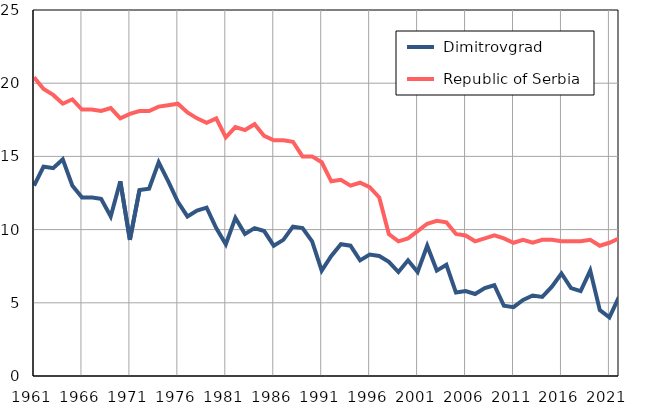
| Category |  Dimitrovgrad |  Republic of Serbia |
|---|---|---|
| 1961.0 | 13 | 20.4 |
| 1962.0 | 14.3 | 19.6 |
| 1963.0 | 14.2 | 19.2 |
| 1964.0 | 14.8 | 18.6 |
| 1965.0 | 13 | 18.9 |
| 1966.0 | 12.2 | 18.2 |
| 1967.0 | 12.2 | 18.2 |
| 1968.0 | 12.1 | 18.1 |
| 1969.0 | 10.9 | 18.3 |
| 1970.0 | 13.3 | 17.6 |
| 1971.0 | 9.3 | 17.9 |
| 1972.0 | 12.7 | 18.1 |
| 1973.0 | 12.8 | 18.1 |
| 1974.0 | 14.6 | 18.4 |
| 1975.0 | 13.3 | 18.5 |
| 1976.0 | 11.9 | 18.6 |
| 1977.0 | 10.9 | 18 |
| 1978.0 | 11.3 | 17.6 |
| 1979.0 | 11.5 | 17.3 |
| 1980.0 | 10.1 | 17.6 |
| 1981.0 | 9 | 16.3 |
| 1982.0 | 10.8 | 17 |
| 1983.0 | 9.7 | 16.8 |
| 1984.0 | 10.1 | 17.2 |
| 1985.0 | 9.9 | 16.4 |
| 1986.0 | 8.9 | 16.1 |
| 1987.0 | 9.3 | 16.1 |
| 1988.0 | 10.2 | 16 |
| 1989.0 | 10.1 | 15 |
| 1990.0 | 9.2 | 15 |
| 1991.0 | 7.2 | 14.6 |
| 1992.0 | 8.2 | 13.3 |
| 1993.0 | 9 | 13.4 |
| 1994.0 | 8.9 | 13 |
| 1995.0 | 7.9 | 13.2 |
| 1996.0 | 8.3 | 12.9 |
| 1997.0 | 8.2 | 12.2 |
| 1998.0 | 7.8 | 9.7 |
| 1999.0 | 7.1 | 9.2 |
| 2000.0 | 7.9 | 9.4 |
| 2001.0 | 7.1 | 9.9 |
| 2002.0 | 8.9 | 10.4 |
| 2003.0 | 7.2 | 10.6 |
| 2004.0 | 7.6 | 10.5 |
| 2005.0 | 5.7 | 9.7 |
| 2006.0 | 5.8 | 9.6 |
| 2007.0 | 5.6 | 9.2 |
| 2008.0 | 6 | 9.4 |
| 2009.0 | 6.2 | 9.6 |
| 2010.0 | 4.8 | 9.4 |
| 2011.0 | 4.7 | 9.1 |
| 2012.0 | 5.2 | 9.3 |
| 2013.0 | 5.5 | 9.1 |
| 2014.0 | 5.4 | 9.3 |
| 2015.0 | 6.1 | 9.3 |
| 2016.0 | 7 | 9.2 |
| 2017.0 | 6 | 9.2 |
| 2018.0 | 5.8 | 9.2 |
| 2019.0 | 7.2 | 9.3 |
| 2020.0 | 4.5 | 8.9 |
| 2021.0 | 4 | 9.1 |
| 2022.0 | 5.4 | 9.4 |